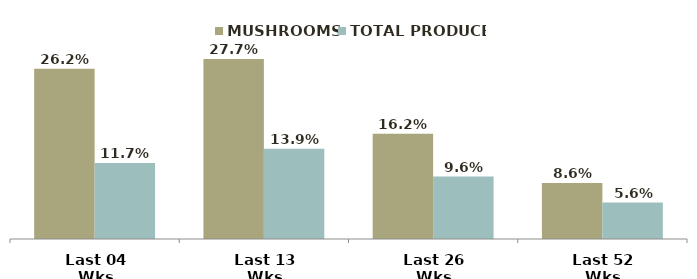
| Category | MUSHROOMS | TOTAL PRODUCE |
|---|---|---|
| Last 04 Wks | 0.262 | 0.117 |
| Last 13 Wks | 0.277 | 0.139 |
| Last 26 Wks | 0.162 | 0.096 |
| Last 52 Wks | 0.086 | 0.056 |